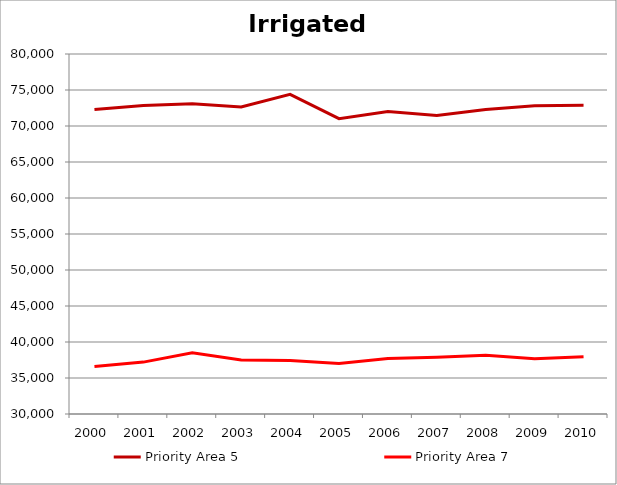
| Category | Priority Area 5 | Priority Area 7 |
|---|---|---|
| 2000.0 | 72290 | 36608 |
| 2001.0 | 72859 | 37208 |
| 2002.0 | 73088 | 38516 |
| 2003.0 | 72632 | 37495 |
| 2004.0 | 74403 | 37415 |
| 2005.0 | 71015 | 37023 |
| 2006.0 | 72010 | 37721 |
| 2007.0 | 71469 | 37889 |
| 2008.0 | 72299 | 38176 |
| 2009.0 | 72818 | 37663 |
| 2010.0 | 72876 | 37965 |